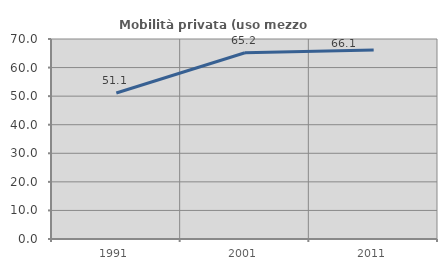
| Category | Mobilità privata (uso mezzo privato) |
|---|---|
| 1991.0 | 51.089 |
| 2001.0 | 65.195 |
| 2011.0 | 66.124 |